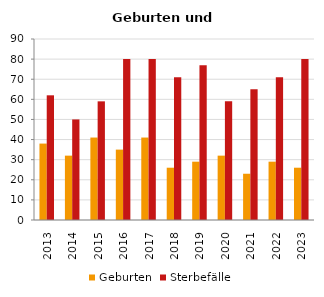
| Category | Geburten | Sterbefälle |
|---|---|---|
| 2013.0 | 38 | 62 |
| 2014.0 | 32 | 50 |
| 2015.0 | 41 | 59 |
| 2016.0 | 35 | 80 |
| 2017.0 | 41 | 80 |
| 2018.0 | 26 | 71 |
| 2019.0 | 29 | 77 |
| 2020.0 | 32 | 59 |
| 2021.0 | 23 | 65 |
| 2022.0 | 29 | 71 |
| 2023.0 | 26 | 80 |